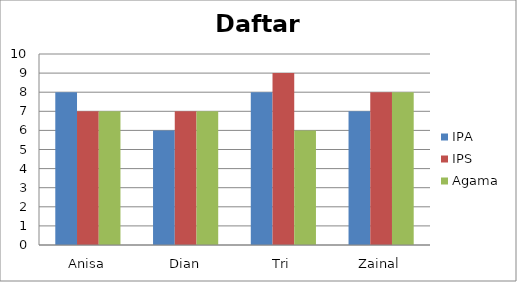
| Category | IPA | IPS | Agama |
|---|---|---|---|
| Anisa | 8 | 7 | 7 |
| Dian | 6 | 7 | 7 |
| Tri | 8 | 9 | 6 |
| Zainal | 7 | 8 | 8 |